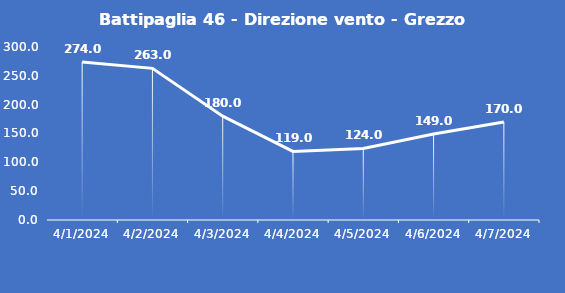
| Category | Battipaglia 46 - Direzione vento - Grezzo (°N) |
|---|---|
| 4/1/24 | 274 |
| 4/2/24 | 263 |
| 4/3/24 | 180 |
| 4/4/24 | 119 |
| 4/5/24 | 124 |
| 4/6/24 | 149 |
| 4/7/24 | 170 |